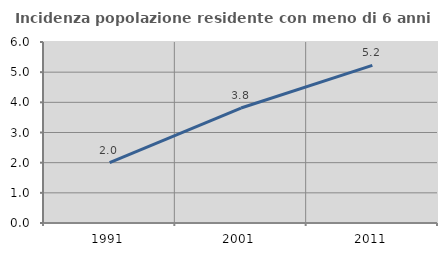
| Category | Incidenza popolazione residente con meno di 6 anni |
|---|---|
| 1991.0 | 2.004 |
| 2001.0 | 3.812 |
| 2011.0 | 5.227 |